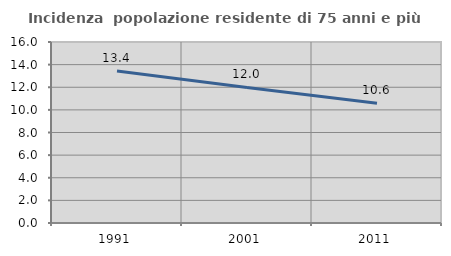
| Category | Incidenza  popolazione residente di 75 anni e più |
|---|---|
| 1991.0 | 13.431 |
| 2001.0 | 11.984 |
| 2011.0 | 10.583 |